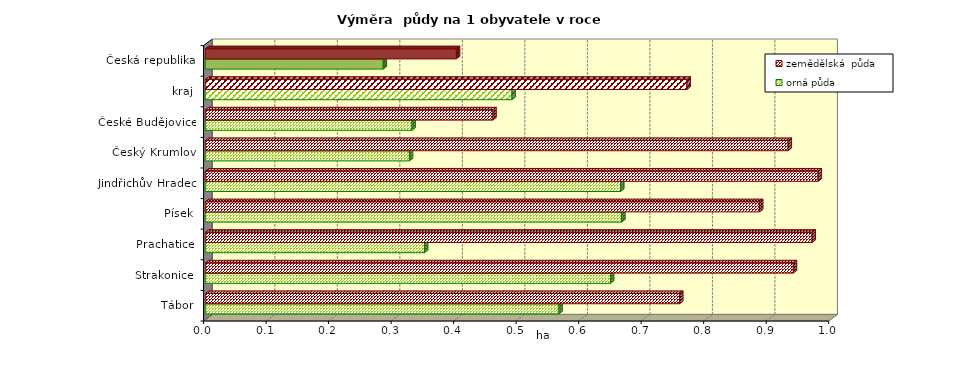
| Category | orná půda | zemědělská  půda |
|---|---|---|
| Tábor | 0.566 | 0.759 |
| Strakonice | 0.648 | 0.941 |
| Prachatice | 0.351 | 0.971 |
| Písek | 0.666 | 0.887 |
| Jindřichův Hradec | 0.664 | 0.98 |
| Český Krumlov | 0.327 | 0.932 |
| České Budějovice | 0.331 | 0.46 |
| kraj | 0.491 | 0.771 |
| Česká republika | 0.285 | 0.402 |